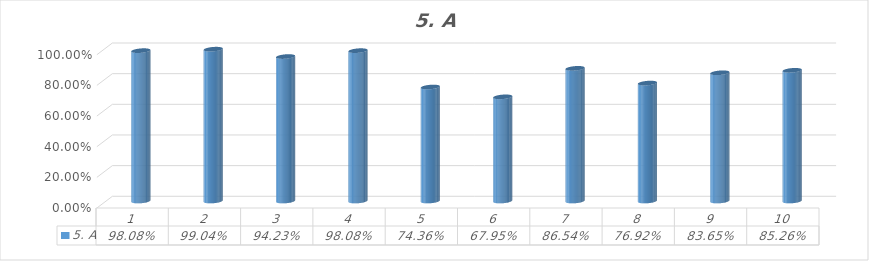
| Category | 5. A |
|---|---|
| 1.0 | 0.981 |
| 2.0 | 0.99 |
| 3.0 | 0.942 |
| 4.0 | 0.981 |
| 5.0 | 0.744 |
| 6.0 | 0.679 |
| 7.0 | 0.865 |
| 8.0 | 0.769 |
| 9.0 | 0.837 |
| 10.0 | 0.853 |